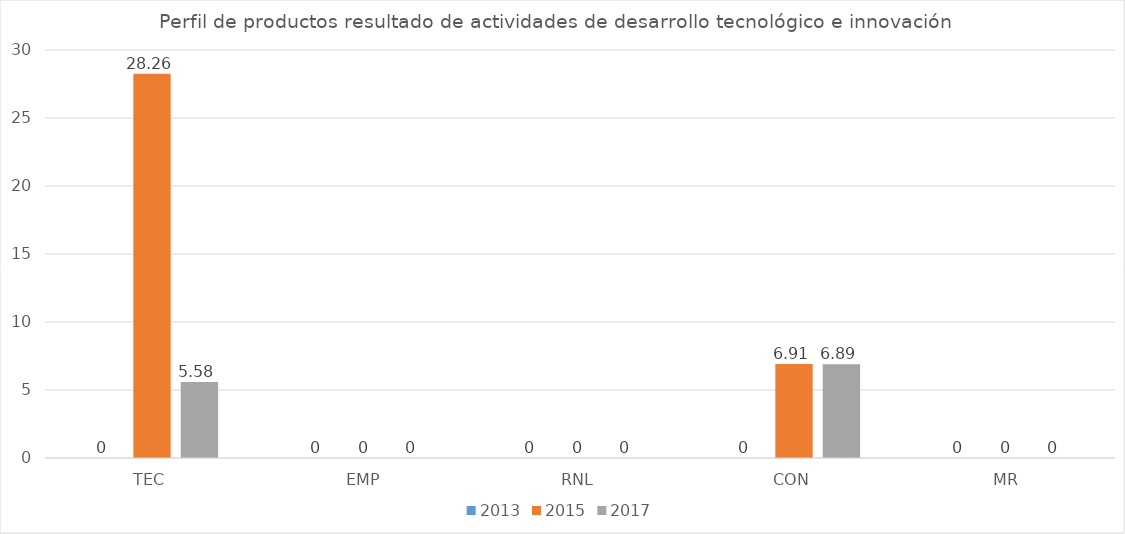
| Category | 2013 | 2015 | 2017 |
|---|---|---|---|
| TEC | 0 | 28.26 | 5.58 |
| EMP | 0 | 0 | 0 |
| RNL | 0 | 0 | 0 |
| CON | 0 | 6.91 | 6.89 |
| MR | 0 | 0 | 0 |